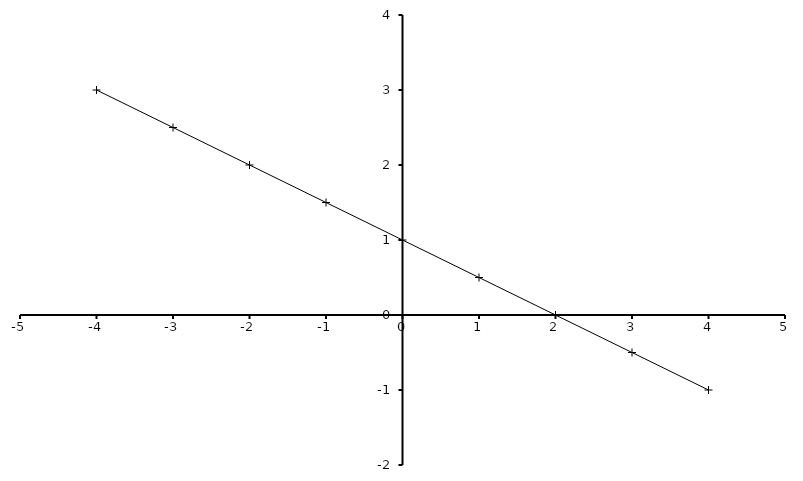
| Category | Series 0 |
|---|---|
| -4.0 | 3 |
| -3.0 | 2.5 |
| -2.0 | 2 |
| -1.0 | 1.5 |
| 0.0 | 1 |
| 1.0 | 0.5 |
| 2.0 | 0 |
| 3.0 | -0.5 |
| 4.0 | -1 |